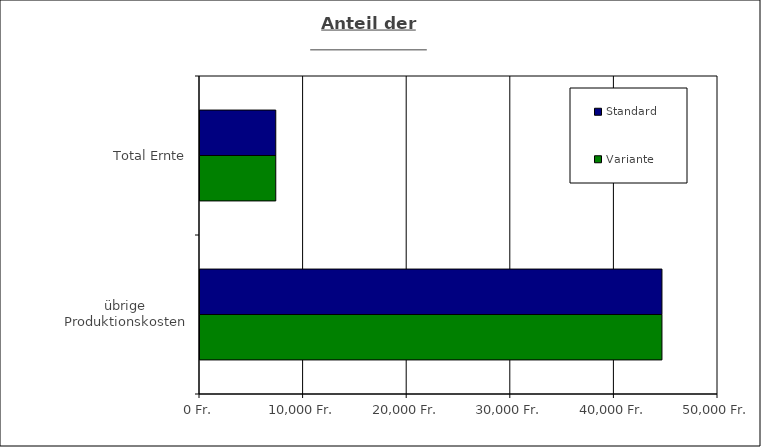
| Category | Standard | Variante  |
|---|---|---|
| Total Ernte | 7314.092 | 7314.092 |
| übrige Produktionskosten | 44590.558 | 44590.586 |